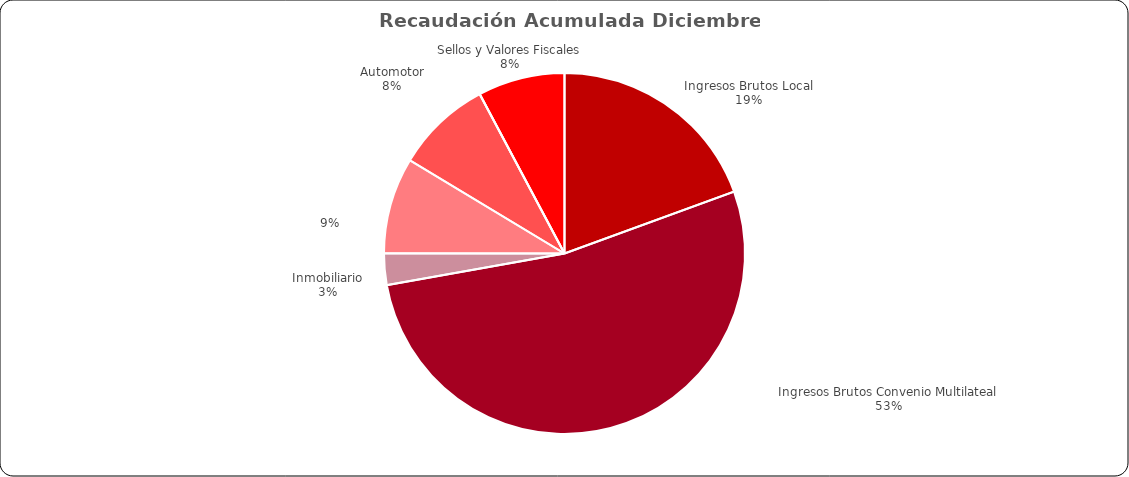
| Category | Recaudación
 Acumulada hasta
Diciembre 2023 |
|---|---|
| Ingresos Brutos Local | 15105482555.27 |
| Ingresos Brutos Convenio Multilateal | 41030214079.1 |
|  Inmobiliario  | 2203867649.5 |
| Automotor | 6694974211.75 |
|  Sellos y Valores Fiscales  | 6670338283.85 |
| Depositos Judiciales | 4847228.06 |
| Otros Ingresos | 6046979037.12 |